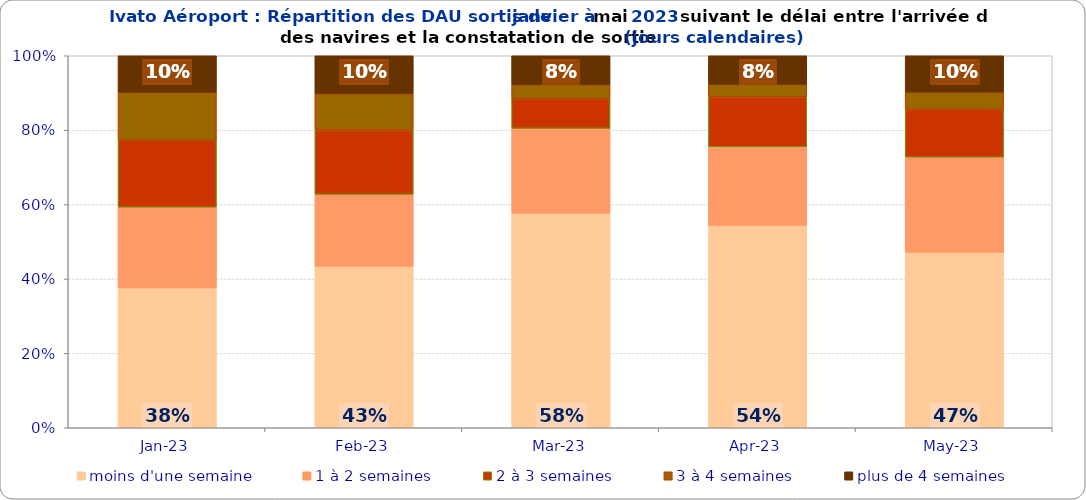
| Category | moins d'une semaine | 1 à 2 semaines | 2 à 3 semaines | 3 à 4 semaines | plus de 4 semaines |
|---|---|---|---|---|---|
| 2023-01-01 | 0.376 | 0.217 | 0.18 | 0.129 | 0.098 |
| 2023-02-01 | 0.434 | 0.194 | 0.173 | 0.098 | 0.102 |
| 2023-03-01 | 0.577 | 0.229 | 0.08 | 0.038 | 0.078 |
| 2023-04-01 | 0.544 | 0.211 | 0.134 | 0.034 | 0.077 |
| 2023-05-01 | 0.472 | 0.256 | 0.128 | 0.047 | 0.098 |